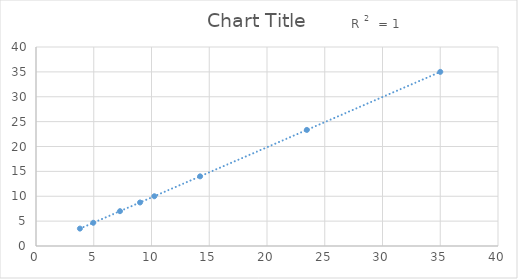
| Category | Series 0 |
|---|---|
| 35.0027887811465 | 35 |
| 23.449772250437736 | 23.333 |
| 14.206699082890461 | 14 |
| 10.244768351058712 | 10 |
| 9.006468342000588 | 8.75 |
| 7.272540897341712 | 7 |
| 4.959484454640391 | 4.667 |
| 3.8017840169239308 | 3.5 |